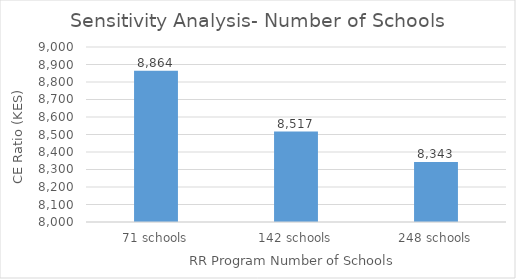
| Category | CE Ratio (KES) |
|---|---|
| 71 schools | 8864 |
| 142 schools | 8517 |
| 248 schools | 8343 |